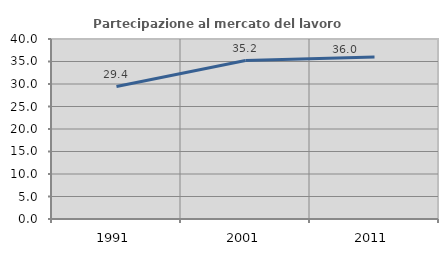
| Category | Partecipazione al mercato del lavoro  femminile |
|---|---|
| 1991.0 | 29.439 |
| 2001.0 | 35.211 |
| 2011.0 | 36.014 |